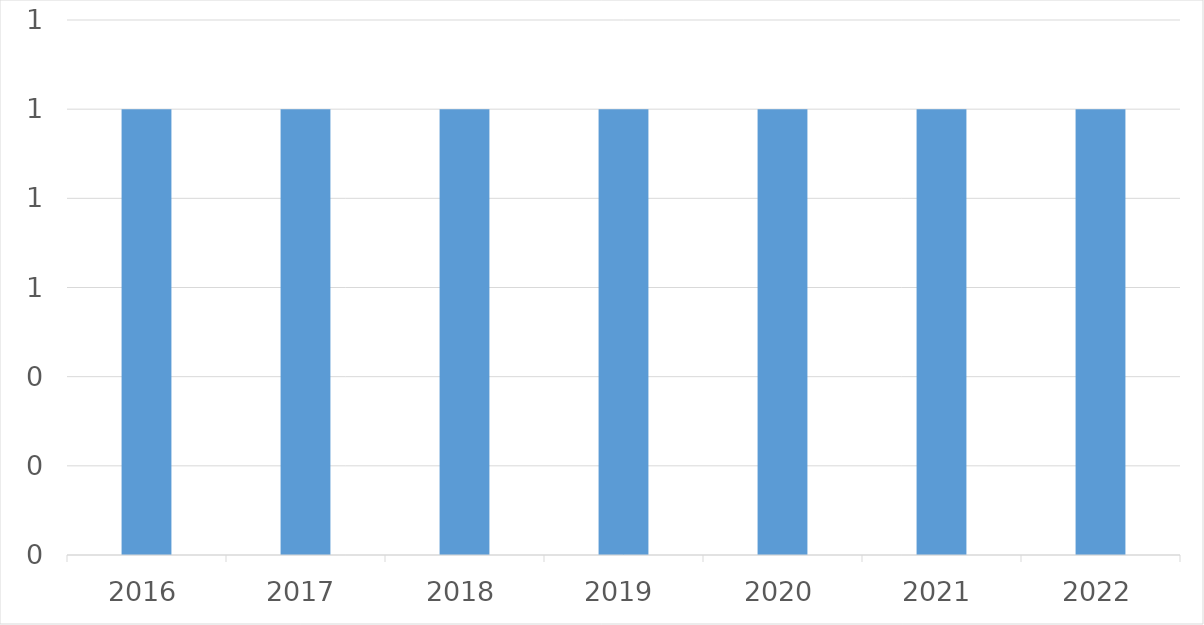
| Category | Series 0 |
|---|---|
| 2016 | 1 |
| 2017 | 1 |
| 2018 | 1 |
| 2019 | 1 |
| 2020 | 1 |
| 2021 | 1 |
| 2022 | 1 |